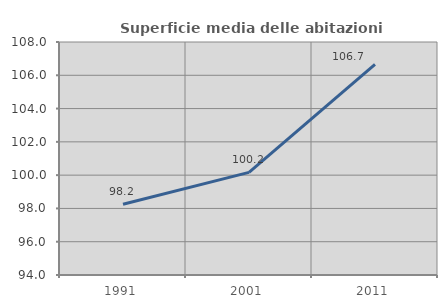
| Category | Superficie media delle abitazioni occupate |
|---|---|
| 1991.0 | 98.247 |
| 2001.0 | 100.166 |
| 2011.0 | 106.659 |